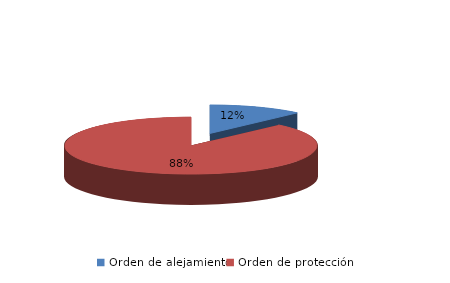
| Category | Series 0 |
|---|---|
| Orden de alejamiento | 128 |
| Orden de protección | 932 |